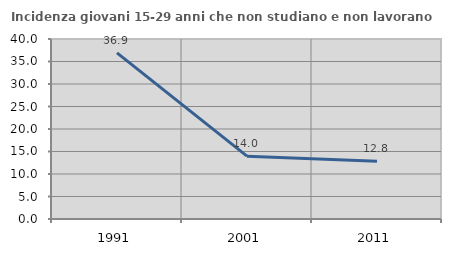
| Category | Incidenza giovani 15-29 anni che non studiano e non lavorano  |
|---|---|
| 1991.0 | 36.923 |
| 2001.0 | 13.964 |
| 2011.0 | 12.834 |